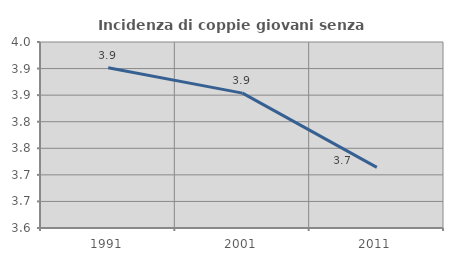
| Category | Incidenza di coppie giovani senza figli |
|---|---|
| 1991.0 | 3.901 |
| 2001.0 | 3.854 |
| 2011.0 | 3.714 |